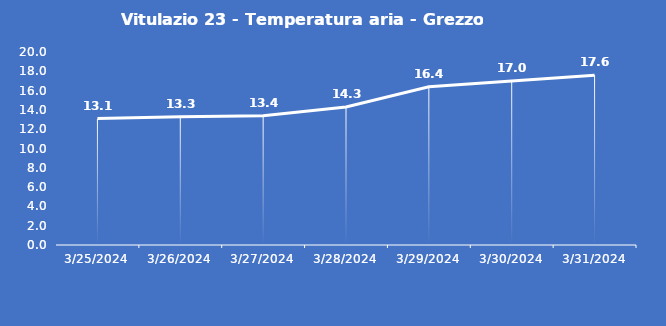
| Category | Vitulazio 23 - Temperatura aria - Grezzo (°C) |
|---|---|
| 3/25/24 | 13.1 |
| 3/26/24 | 13.3 |
| 3/27/24 | 13.4 |
| 3/28/24 | 14.3 |
| 3/29/24 | 16.4 |
| 3/30/24 | 17 |
| 3/31/24 | 17.6 |